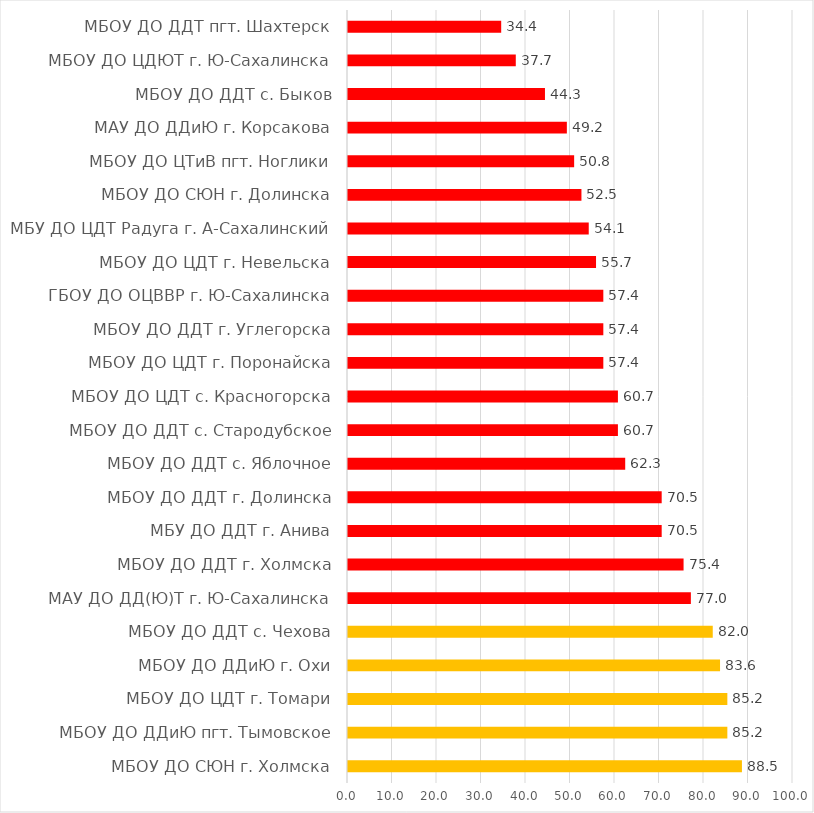
| Category | Series 0 |
|---|---|
| МБОУ ДО СЮН г. Холмска | 88.525 |
| МБОУ ДО ДДиЮ пгт. Тымовское | 85.246 |
| МБОУ ДО ЦДТ г. Томари | 85.246 |
| МБОУ ДО ДДиЮ г. Охи | 83.607 |
| МБОУ ДО ДДТ с. Чехова | 81.967 |
| МАУ ДО ДД(Ю)Т г. Ю-Сахалинска | 77.049 |
| МБОУ ДО ДДТ г. Холмска | 75.41 |
| МБУ ДО ДДТ г. Анива | 70.492 |
| МБОУ ДО ДДТ г. Долинска | 70.492 |
| МБОУ ДО ДДТ с. Яблочное | 62.295 |
| МБОУ ДО ДДТ с. Стародубское | 60.656 |
| МБОУ ДО ЦДТ с. Красногорска | 60.656 |
| МБОУ ДО ЦДТ г. Поронайска | 57.377 |
| МБОУ ДО ДДТ г. Углегорска | 57.377 |
| ГБОУ ДО ОЦВВР г. Ю-Сахалинска | 57.377 |
| МБОУ ДО ЦДТ г. Невельска | 55.738 |
| МБУ ДО ЦДТ Радуга г. А-Сахалинский | 54.098 |
| МБОУ ДО СЮН г. Долинска | 52.459 |
| МБОУ ДО ЦТиВ пгт. Ноглики | 50.82 |
| МАУ ДО ДДиЮ г. Корсакова | 49.18 |
| МБОУ ДО ДДТ с. Быков | 44.262 |
| МБОУ ДО ЦДЮТ г. Ю-Сахалинска | 37.705 |
| МБОУ ДО ДДТ пгт. Шахтерск | 34.426 |